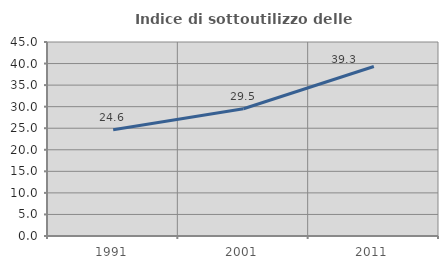
| Category | Indice di sottoutilizzo delle abitazioni  |
|---|---|
| 1991.0 | 24.628 |
| 2001.0 | 29.525 |
| 2011.0 | 39.323 |